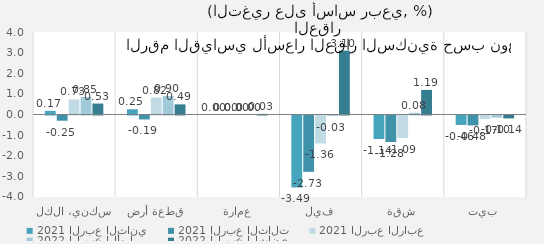
| Category | 2021 الربع الثاني | 2021 الربع الثالث | 2021 الربع الرابع | 2022 الربع الأول | 2022 الربع الثاني |
|---|---|---|---|---|---|
| سكني، الكل | 0.174 | -0.253 | 0.729 | 0.854 | 0.531 |
| قطعة أرض | 0.254 | -0.192 | 0.823 | 0.896 | 0.492 |
| عمارة | 0 | 0 | 0 | 0 | 0.031 |
| فيلا | -3.489 | -2.731 | -1.357 | -0.025 | 3.096 |
| شقة | -1.141 | -1.282 | -1.089 | 0.082 | 1.193 |
| بيت | -0.459 | -0.48 | -0.174 | -0.105 | -0.142 |